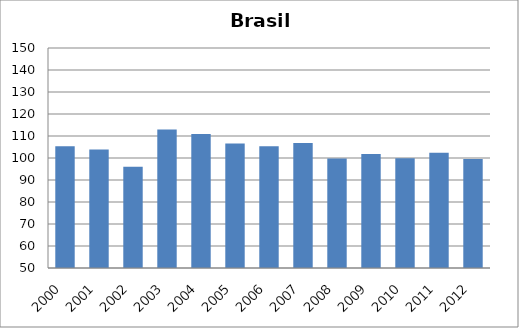
| Category | Tríplice viral/sarampo |
|---|---|
| 2000.0 | 105.35 |
| 2001.0 | 103.85 |
| 2002.0 | 96.02 |
| 2003.0 | 112.95 |
| 2004.0 | 110.93 |
| 2005.0 | 106.55 |
| 2006.0 | 105.35 |
| 2007.0 | 106.8 |
| 2008.0 | 99.81 |
| 2009.0 | 101.8 |
| 2010.0 | 99.93 |
| 2011.0 | 102.39 |
| 2012.0 | 99.5 |